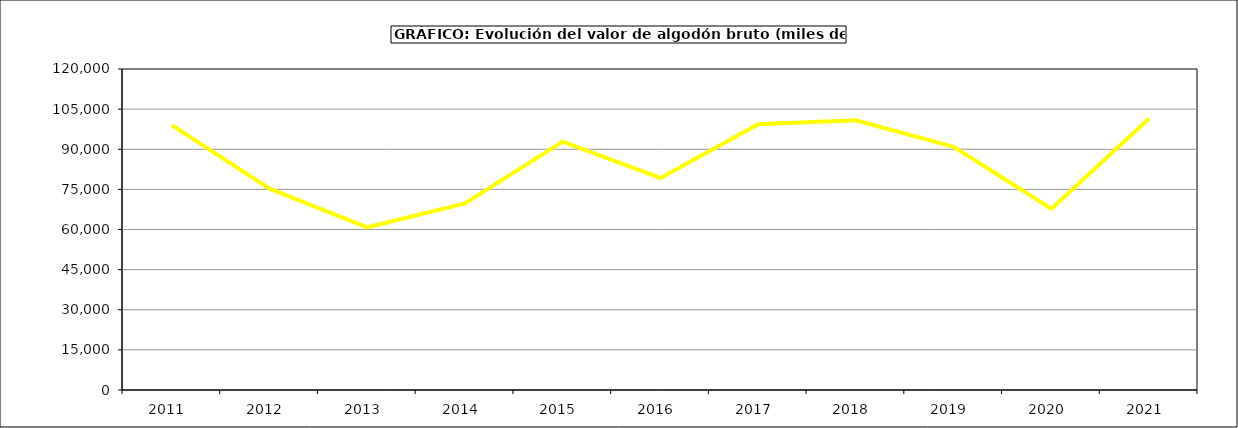
| Category | Valor |
|---|---|
| 2011.0 | 99030.746 |
| 2012.0 | 75288.36 |
| 2013.0 | 60816.95 |
| 2014.0 | 69735 |
| 2015.0 | 92834 |
| 2016.0 | 79254 |
| 2017.0 | 99372.773 |
| 2018.0 | 100830.014 |
| 2019.0 | 90873.491 |
| 2020.0 | 67736.259 |
| 2021.0 | 101471.672 |